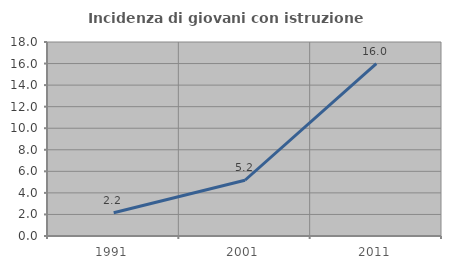
| Category | Incidenza di giovani con istruzione universitaria |
|---|---|
| 1991.0 | 2.151 |
| 2001.0 | 5.172 |
| 2011.0 | 15.99 |